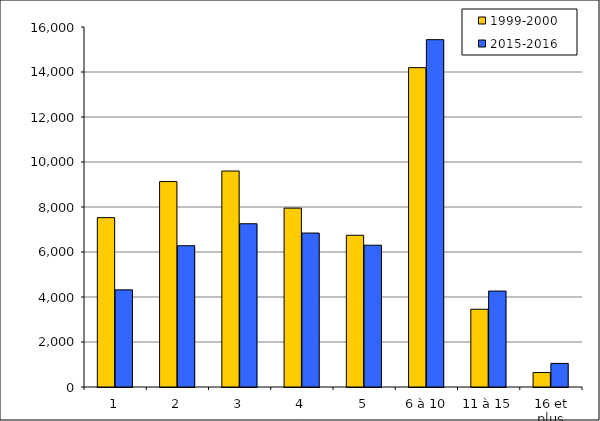
| Category | 1999-2000 | 2015-2016 |
|---|---|---|
| 1 | 7527 | 4317 |
| 2 | 9130 | 6279 |
| 3 | 9599 | 7256 |
| 4 | 7950 | 6842 |
| 5 | 6744 | 6302 |
| 6 à 10 | 14193 | 15437 |
| 11 à 15 | 3456 | 4263 |
| 16 et plus | 643 | 1049 |